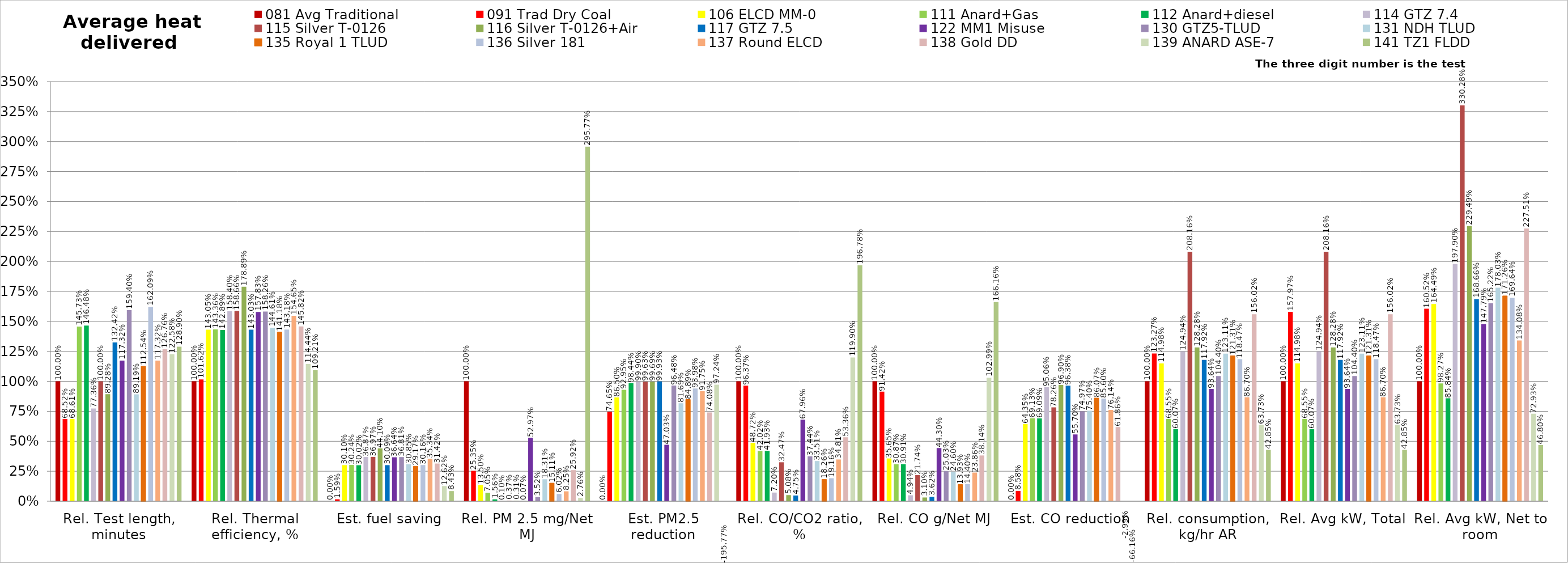
| Category | 081 Avg Traditional | 091 Trad Dry Coal | 106 ELCD MM-0 | 111 Anard+Gas | 112 Anard+diesel | 114 GTZ 7.4 | 115 Silver T-0126 | 116 Silver T-0126+Air | 117 GTZ 7.5 | 122 MM1 Misuse | 130 GTZ5-TLUD | 131 NDH TLUD | 135 Royal 1 TLUD | 136 Silver 181 | 137 Round ELCD | 138 Gold DD | 139 ANARD ASE-7 | 141 TZ1 FLDD |
|---|---|---|---|---|---|---|---|---|---|---|---|---|---|---|---|---|---|---|
| Rel. Test length, minutes | 1 | 0.685 | 0.686 | 1.457 | 1.465 | 0.774 | 1 | 0.893 | 1.324 | 1.173 | 1.594 | 0.892 | 1.125 | 1.621 | 1.173 | 1.268 | 1.226 | 1.289 |
| Rel. Thermal efficiency, % | 1 | 1.016 | 1.431 | 1.434 | 1.429 | 1.584 | 1.587 | 1.789 | 1.43 | 1.578 | 1.583 | 1.446 | 1.412 | 1.432 | 1.546 | 1.458 | 1.144 | 1.092 |
| Est. fuel saving | 0 | 0.016 | 0.301 | 0.302 | 0.3 | 0.369 | 0.37 | 0.441 | 0.301 | 0.366 | 0.368 | 0.309 | 0.292 | 0.302 | 0.353 | 0.314 | 0.126 | 0.084 |
| Rel. PM 2.5 mg/Net MJ | 1 | 0.253 | 0.135 | 0.071 | 0.016 | 0.001 | 0.004 | 0.003 | 0.001 | 0.53 | 0.035 | 0.183 | 0.151 | 0.06 | 0.082 | 0.259 | 0.028 | 2.958 |
| Est. PM2.5 reduction | 0 | 0.747 | 0.865 | 0.929 | 0.984 | 0.999 | 0.996 | 0.997 | 0.999 | 0.47 | 0.965 | 0.817 | 0.849 | 0.94 | 0.918 | 0.741 | 0.972 | -1.958 |
| Rel. CO/CO2 ratio, % | 1 | 0.964 | 0.487 | 0.42 | 0.419 | 0.072 | 0.325 | 0.051 | 0.047 | 0.68 | 0.374 | 0.335 | 0.183 | 0.192 | 0.348 | 0.534 | 1.199 | 1.968 |
| Rel. CO g/Net MJ | 1 | 0.914 | 0.357 | 0.309 | 0.309 | 0.049 | 0.217 | 0.031 | 0.036 | 0.443 | 0.25 | 0.246 | 0.139 | 0.144 | 0.239 | 0.381 | 1.03 | 1.662 |
| Est. CO reduction | 0 | 0.086 | 0.643 | 0.691 | 0.691 | 0.951 | 0.783 | 0.969 | 0.964 | 0.557 | 0.75 | 0.754 | 0.861 | 0.856 | 0.761 | 0.619 | -0.03 | -0.662 |
| Rel. consumption, kg/hr AR | 1 | 1.233 | 1.15 | 0.686 | 0.601 | 1.249 | 2.082 | 1.283 | 1.179 | 0.936 | 1.044 | 1.231 | 1.213 | 1.185 | 0.867 | 1.56 | 0.637 | 0.429 |
| Rel. Avg kW, Total | 1 | 1.58 | 1.15 | 0.686 | 0.601 | 1.249 | 2.082 | 1.283 | 1.179 | 0.936 | 1.044 | 1.231 | 1.213 | 1.185 | 0.867 | 1.56 | 0.637 | 0.429 |
| Rel. Avg kW, Net to room | 1 | 1.605 | 1.645 | 0.983 | 0.858 | 1.979 | 3.303 | 2.295 | 1.687 | 1.478 | 1.652 | 1.78 | 1.713 | 1.696 | 1.341 | 2.275 | 0.729 | 0.468 |